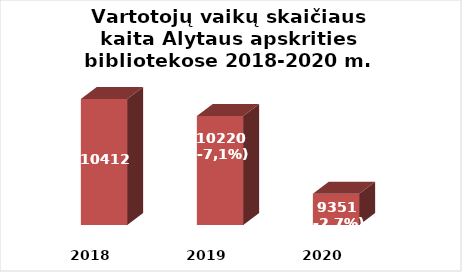
| Category | Series 0 |
|---|---|
| 2018.0 | 10412 |
| 2019.0 | 10220 |
| 2020.0 | 9351 |